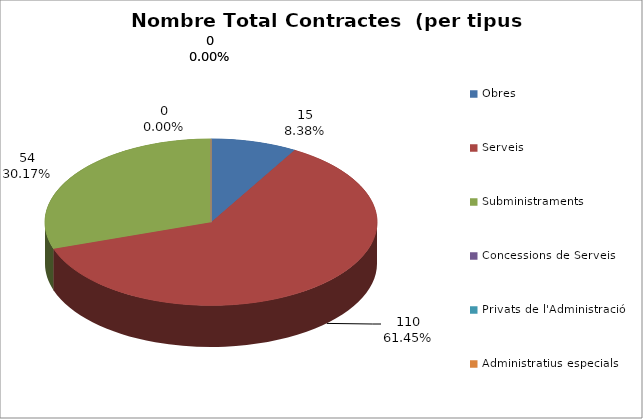
| Category | Nombre Total Contractes |
|---|---|
| Obres | 15 |
| Serveis | 110 |
| Subministraments | 54 |
| Concessions de Serveis | 0 |
| Privats de l'Administració | 0 |
| Administratius especials | 0 |